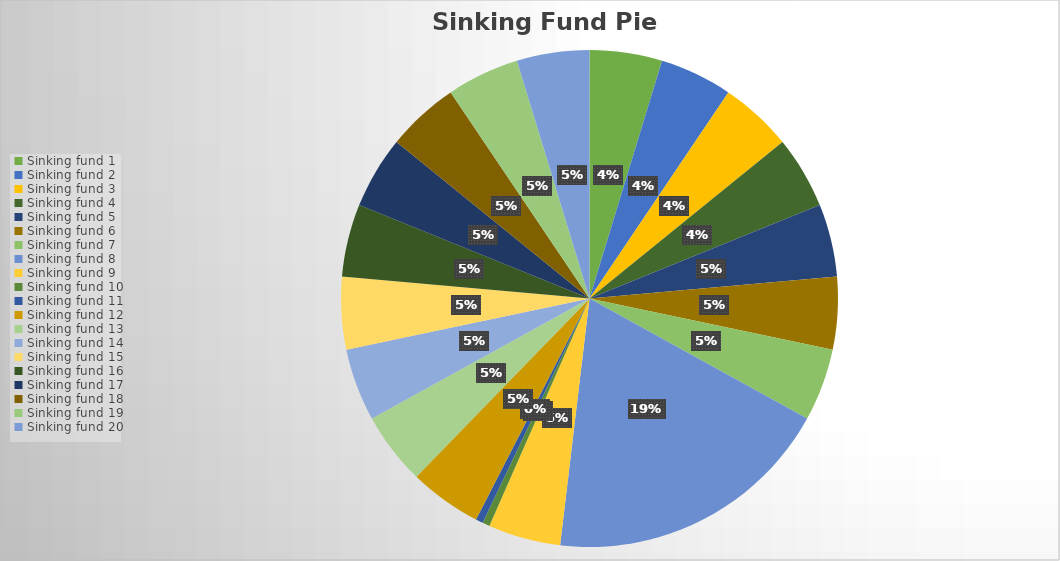
| Category | Beginning Balance | JAN | FEB | MAR | APR | MAY | JUN | JUL | AUG | SEP | OCT | NOV | DEC |
|---|---|---|---|---|---|---|---|---|---|---|---|---|---|
| Sinking fund 1 | 100 | 40 | -10 | 0 | 0 | 0 | 0 | 0 | 0 | 0 | 0 | 0 | 0 |
| Sinking fund 2 | 100 | 0 | 0 | 0 | 0 | 0 | 0 | 0 | 0 | 0 | 0 | 0 | 0 |
| Sinking fund 3 | 100 | 0 | 0 | 0 | 0 | 0 | 0 | 0 | 0 | 0 | 0 | 0 | 0 |
| Sinking fund 4 | 100 | 0 | 0 | 0 | 0 | 0 | 0 | 0 | 0 | 0 | 0 | 0 | 0 |
| Sinking fund 5 | 100 | 0 | 0 | 0 | 0 | 0 | 0 | 0 | 0 | 0 | 0 | 0 | 0 |
| Sinking fund 6 | 100 | 0 | 0 | 0 | 0 | 0 | 0 | 0 | 0 | 0 | 0 | 0 | 0 |
| Sinking fund 7 | 100 | 0 | 0 | 0 | 0 | 0 | 0 | 0 | 0 | 0 | 0 | 0 | 0 |
| Sinking fund 8 | 400 | 0 | 0 | 0 | 0 | 0 | 0 | 0 | 0 | 0 | 0 | 0 | 0 |
| Sinking fund 9 | 100 | 0 | 0 | 0 | 0 | 0 | 0 | 0 | 0 | 0 | 0 | 0 | 0 |
| Sinking fund 10 | 10 | 0 | 0 | 0 | 0 | 0 | 0 | 0 | 0 | 0 | 0 | 0 | 0 |
| Sinking fund 11 | 10 | 0 | 0 | 0 | 0 | 0 | 0 | 0 | 0 | 0 | 0 | 0 | 0 |
| Sinking fund 12 | 100 | 0 | 0 | 0 | 0 | 0 | 0 | 0 | 0 | 0 | 0 | 0 | 0 |
| Sinking fund 13 | 100 | 0 | 0 | 0 | 0 | 0 | 0 | 0 | 0 | 0 | 0 | 0 | 0 |
| Sinking fund 14 | 100 | 0 | 0 | 0 | 0 | 0 | 0 | 0 | 0 | 0 | 0 | 0 | 0 |
| Sinking fund 15 | 100 | 0 | 0 | 0 | 0 | 0 | 0 | 0 | 0 | 0 | 0 | 0 | 0 |
| Sinking fund 16 | 100 | 0 | 0 | 0 | 0 | 0 | 0 | 0 | 0 | 0 | 0 | 0 | 0 |
| Sinking fund 17 | 100 | 0 | 0 | 0 | 0 | 0 | 0 | 0 | 0 | 0 | 0 | 0 | 0 |
| Sinking fund 18 | 100 | 0 | 0 | 0 | 0 | 0 | 0 | 0 | 0 | 0 | 0 | 0 | 0 |
| Sinking fund 19 | 100 | 0 | 0 | 0 | 0 | 0 | 0 | 0 | 0 | 0 | 0 | 0 | 0 |
| Sinking fund 20 | 100 | 0 | 0 | 0 | 0 | 0 | 0 | 0 | 0 | 0 | 0 | 0 | 0 |